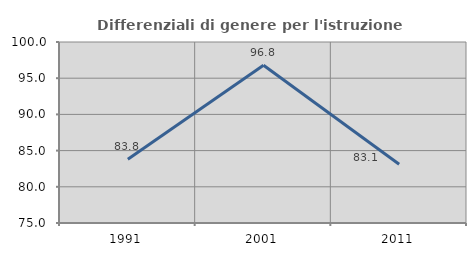
| Category | Differenziali di genere per l'istruzione superiore |
|---|---|
| 1991.0 | 83.806 |
| 2001.0 | 96.786 |
| 2011.0 | 83.122 |